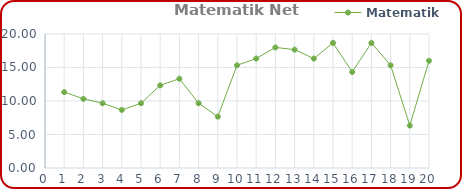
| Category | Matematik |
|---|---|
| 0 | 11.333 |
| 1 | 10.333 |
| 2 | 9.667 |
| 3 | 8.667 |
| 4 | 9.667 |
| 5 | 12.333 |
| 6 | 13.333 |
| 7 | 9.667 |
| 8 | 7.667 |
| 9 | 15.333 |
| 10 | 16.333 |
| 11 | 18 |
| 12 | 17.667 |
| 13 | 16.333 |
| 14 | 18.667 |
| 15 | 14.333 |
| 16 | 18.667 |
| 17 | 15.333 |
| 18 | 6.333 |
| 19 | 16 |